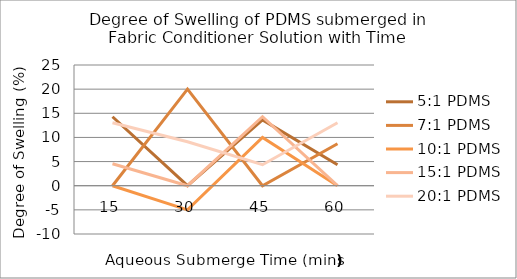
| Category | 5:1 PDMS | 7:1 PDMS | 10:1 PDMS | 15:1 PDMS | 20:1 PDMS |
|---|---|---|---|---|---|
| 0 | 14.286 | 0 | 0 | 4.545 | 13.043 |
| 1 | 0 | 20 | -5 | 0 | 9.091 |
| 2 | 13.636 | 0 | 10 | 14.286 | 4.348 |
| 3 | 4.348 | 8.696 | 0 | 0 | 13.043 |